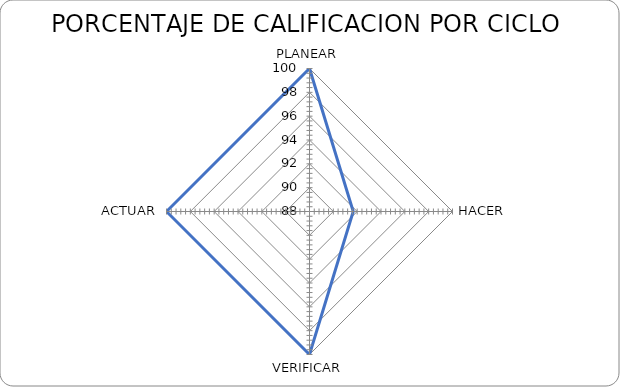
| Category | Series 0 |
|---|---|
| PLANEAR | 100 |
| HACER | 91.67 |
| VERIFICAR | 100 |
| ACTUAR | 100 |